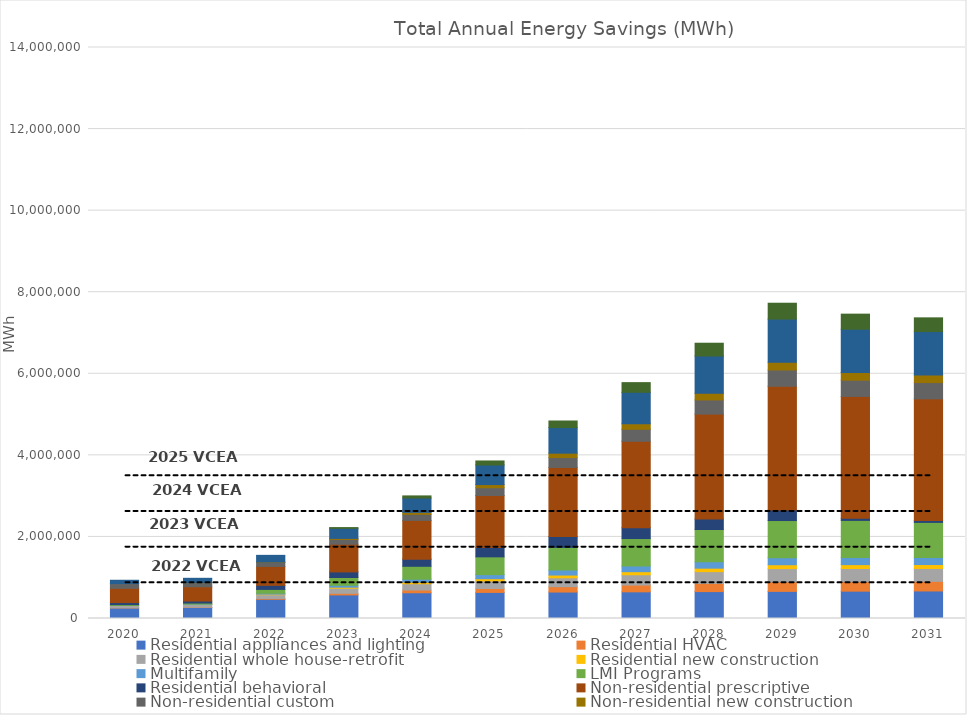
| Category | Residential appliances and lighting  | Residential HVAC | Residential whole house-retrofit  | Residential new construction  | Multifamily | LMI Programs | Residential behavioral  | Non-residential prescriptive | Non-residential custom  | Non-residential new construction  | Non-residential small business   | Large energy users |
|---|---|---|---|---|---|---|---|---|---|---|---|---|
| 2020.0 | 259170.667 | 1593.597 | 58421.97 | 0 | 0 | 20675.371 | 50809.784 | 348716.631 | 116543.667 | 0 | 81461.267 | 0 |
| 2021.0 | 270477.816 | 6243.803 | 66309.805 | 4504.188 | 5776.113 | 25165.75 | 49024.815 | 351035.415 | 99286.785 | 564.086 | 107110.691 | 0 |
| 2022.0 | 471421.544 | 20272.868 | 90402.5 | 14094.816 | 23202.249 | 93412.238 | 99948.017 | 464398.879 | 98616.354 | 9113.933 | 163296.871 | 0 |
| 2023.0 | 577620.244 | 40117.627 | 123962.515 | 25339.361 | 46072.374 | 191812.373 | 137526.282 | 678621.52 | 118023.821 | 24775.937 | 246299.389 | 18968.353 |
| 2024.0 | 631139.977 | 66291.689 | 154446.261 | 39553.587 | 71838.317 | 316752.5 | 175316.621 | 949932.099 | 148618.88 | 48013.056 | 351846.197 | 52162.971 |
| 2025.0 | 639401.471 | 96652.086 | 183899.389 | 55729.158 | 100500.079 | 435813.246 | 227280.689 | 1276004.177 | 190746.001 | 77415.078 | 479567.074 | 99583.854 |
| 2026.0 | 648688.979 | 131367.565 | 217832.819 | 67248.234 | 123508.737 | 553828.475 | 266219.774 | 1694469.502 | 242594.766 | 107712.989 | 627968.905 | 161231.001 |
| 2027.0 | 654017.748 | 166077.514 | 252181.057 | 75387.284 | 139743.411 | 672691.902 | 262844.236 | 2121960.829 | 294443.532 | 134633.571 | 772017.819 | 237104.413 |
| 2028.0 | 659621.815 | 200777.571 | 288148.011 | 85242.824 | 155948.809 | 791762.693 | 259698.446 | 2571241.663 | 346292.297 | 161548.172 | 916031.018 | 312977.826 |
| 2029.0 | 664799.259 | 235469.058 | 322817.139 | 95078.898 | 172129.597 | 911404.079 | 256764.731 | 3036048.04 | 398141.062 | 188457.509 | 1060013.599 | 388851.238 |
| 2030.0 | 669851.082 | 235703.761 | 319926.955 | 95623.315 | 172848.94 | 911201.1 | 50809.784 | 2988649.839 | 398141.062 | 188656.323 | 1061134.513 | 369882.885 |
| 2031.0 | 674784.418 | 235932.973 | 315962.501 | 96154.954 | 173552.154 | 859840.669 | 49024.815 | 2980809.885 | 398141.062 | 188851.54 | 1061816.813 | 336688.267 |